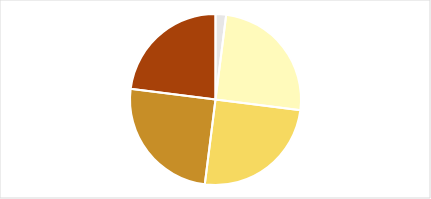
| Category | Series 0 |
|---|---|
| 0 | 0.02 |
| 1 | 0.25 |
| 2 | 0.25 |
| 3 | 0.25 |
| 4 | 0.23 |